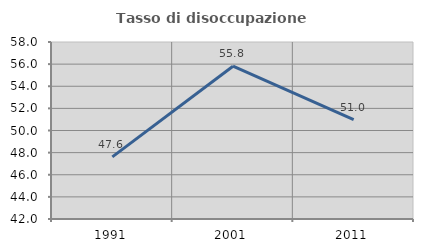
| Category | Tasso di disoccupazione giovanile  |
|---|---|
| 1991.0 | 47.619 |
| 2001.0 | 55.814 |
| 2011.0 | 50.98 |